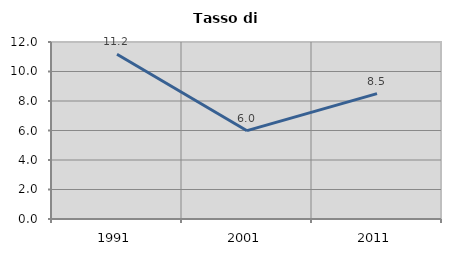
| Category | Tasso di disoccupazione   |
|---|---|
| 1991.0 | 11.173 |
| 2001.0 | 5.988 |
| 2011.0 | 8.497 |